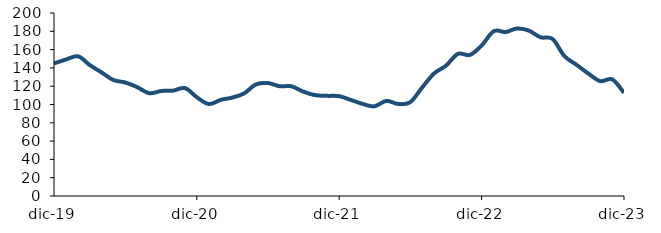
| Category | Series 0 |
|---|---|
| 2019-12-01 | 144.831 |
| 2020-01-01 | 149.242 |
| 2020-02-01 | 152.669 |
| 2020-03-01 | 143.292 |
| 2020-04-01 | 135.035 |
| 2020-05-01 | 126.788 |
| 2020-06-01 | 124.002 |
| 2020-07-01 | 118.983 |
| 2020-08-01 | 112.386 |
| 2020-09-01 | 114.763 |
| 2020-10-01 | 115.159 |
| 2020-11-01 | 117.935 |
| 2020-12-01 | 107.927 |
| 2021-01-01 | 100.528 |
| 2021-02-01 | 105.144 |
| 2021-03-01 | 107.453 |
| 2021-04-01 | 112.047 |
| 2021-05-01 | 121.818 |
| 2021-06-01 | 123.47 |
| 2021-07-01 | 119.987 |
| 2021-08-01 | 119.848 |
| 2021-09-01 | 113.862 |
| 2021-10-01 | 110.18 |
| 2021-11-01 | 109.442 |
| 2021-12-01 | 109.08 |
| 2022-01-01 | 104.823 |
| 2022-02-01 | 100.399 |
| 2022-03-01 | 98.015 |
| 2022-04-01 | 103.921 |
| 2022-05-01 | 100.574 |
| 2022-06-01 | 102.532 |
| 2022-07-01 | 118.21 |
| 2022-08-01 | 133.857 |
| 2022-09-01 | 142.486 |
| 2022-10-01 | 155.309 |
| 2022-11-01 | 154.196 |
| 2022-12-01 | 164.427 |
| 2023-01-01 | 180.099 |
| 2023-02-01 | 179.207 |
| 2023-03-01 | 183.024 |
| 2023-04-01 | 180.783 |
| 2023-05-01 | 173.471 |
| 2023-06-01 | 171.62 |
| 2023-07-01 | 153.01 |
| 2023-08-01 | 143.477 |
| 2023-09-01 | 133.7 |
| 2023-10-01 | 125.582 |
| 2023-11-01 | 127.417 |
| 2023-12-01 | 112.83 |